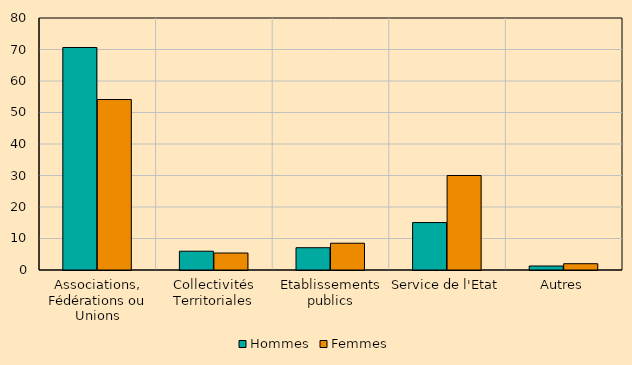
| Category | Hommes | Femmes |
|---|---|---|
| Associations, Fédérations ou Unions | 70.635 | 54.119 |
| Collectivités Territoriales | 5.964 | 5.389 |
| Etablissements publics | 7.074 | 8.5 |
| Service de l'Etat | 15.06 | 29.997 |
| Autres | 1.267 | 1.995 |